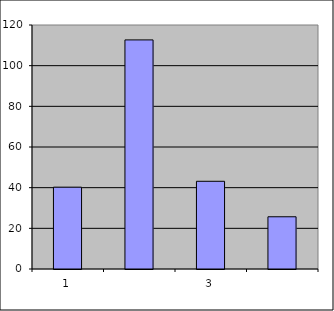
| Category | Series 0 |
|---|---|
| 0 | 40.25 |
| 1 | 112.666 |
| 2 | 43.14 |
| 3 | 25.684 |